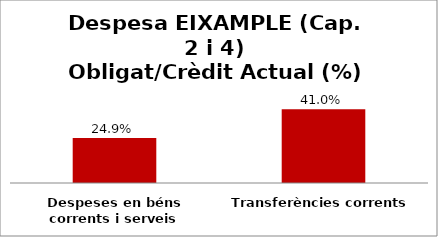
| Category | Series 0 |
|---|---|
| Despeses en béns corrents i serveis | 0.249 |
| Transferències corrents | 0.41 |